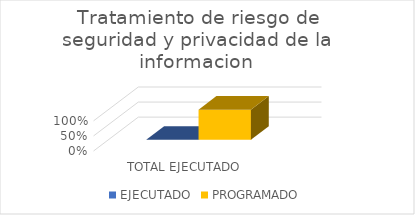
| Category | EJECUTADO | PROGRAMADO |
|---|---|---|
| TOTAL EJECUTADO | 0 | 1 |